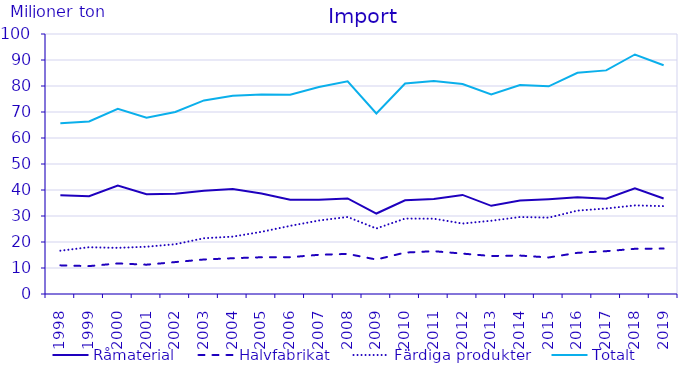
| Category | Råmaterial | Halvfabrikat | Färdiga produkter | Totalt |
|---|---|---|---|---|
| 1998.0 | 37.966 | 11.014 | 16.661 | 65.641 |
| 1999.0 | 37.636 | 10.727 | 17.985 | 66.347 |
| 2000.0 | 41.688 | 11.758 | 17.752 | 71.198 |
| 2001.0 | 38.371 | 11.277 | 18.182 | 67.83 |
| 2002.0 | 38.577 | 12.277 | 19.143 | 69.998 |
| 2003.0 | 39.734 | 13.273 | 21.444 | 74.451 |
| 2004.0 | 40.405 | 13.753 | 22.066 | 76.225 |
| 2005.0 | 38.684 | 14.132 | 23.906 | 76.722 |
| 2006.0 | 36.256 | 14.162 | 26.212 | 76.629 |
| 2007.0 | 36.27 | 15.078 | 28.265 | 79.613 |
| 2008.0 | 36.749 | 15.423 | 29.631 | 81.803 |
| 2009.0 | 30.949 | 13.254 | 25.211 | 69.414 |
| 2010.0 | 36.017 | 15.931 | 29.011 | 80.96 |
| 2011.0 | 36.516 | 16.464 | 28.968 | 81.948 |
| 2012.0 | 38.104 | 15.532 | 27.102 | 80.737 |
| 2013.0 | 33.918 | 14.615 | 28.185 | 76.719 |
| 2014.0 | 35.964 | 14.786 | 29.615 | 80.364 |
| 2015.0 | 36.447 | 14.052 | 29.373 | 79.871 |
| 2016.0 | 37.172 | 15.832 | 32.07 | 85.074 |
| 2017.0 | 36.644 | 16.467 | 32.893 | 86.004 |
| 2018.0 | 40.659 | 17.381 | 34.081 | 92.121 |
| 2019.0 | 36.723 | 17.482 | 33.799 | 88.003 |